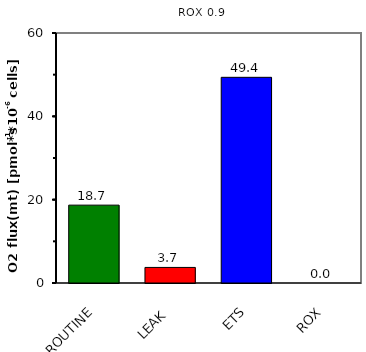
| Category | ROX 0,9 |
|---|---|
| ROUTINE | 18.688 |
| LEAK | 3.737 |
| ETS | 49.363 |
| ROX | 0 |